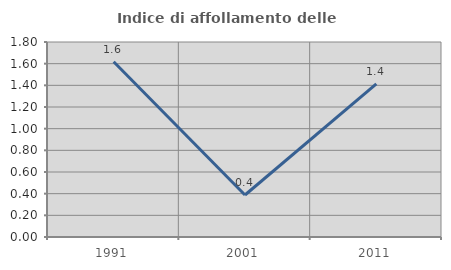
| Category | Indice di affollamento delle abitazioni  |
|---|---|
| 1991.0 | 1.618 |
| 2001.0 | 0.388 |
| 2011.0 | 1.413 |